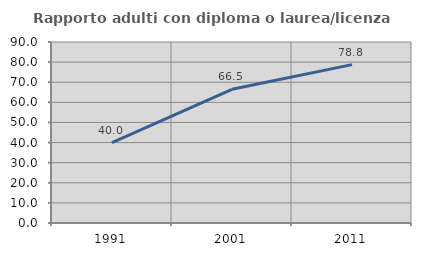
| Category | Rapporto adulti con diploma o laurea/licenza media  |
|---|---|
| 1991.0 | 40 |
| 2001.0 | 66.471 |
| 2011.0 | 78.756 |